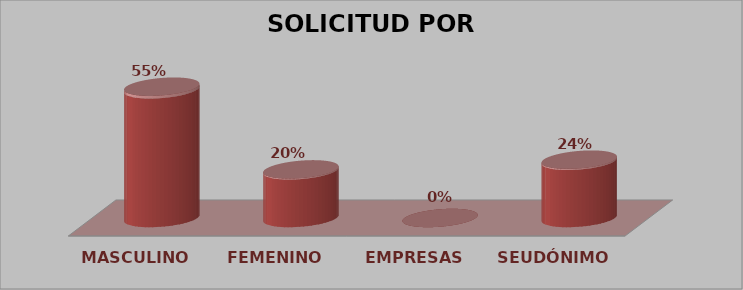
| Category | SOLICITUD POR GÉNERO | Series 1 |
|---|---|---|
| MASCULINO | 27 | 0.551 |
| FEMENINO | 10 | 0.204 |
| EMPRESAS | 0 | 0 |
| SEUDÓNIMO | 12 | 0.245 |